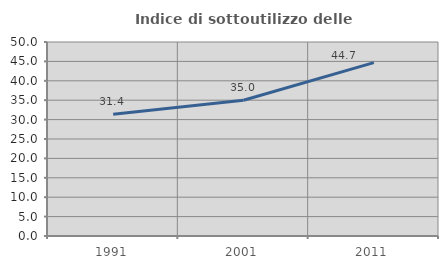
| Category | Indice di sottoutilizzo delle abitazioni  |
|---|---|
| 1991.0 | 31.362 |
| 2001.0 | 35.002 |
| 2011.0 | 44.683 |